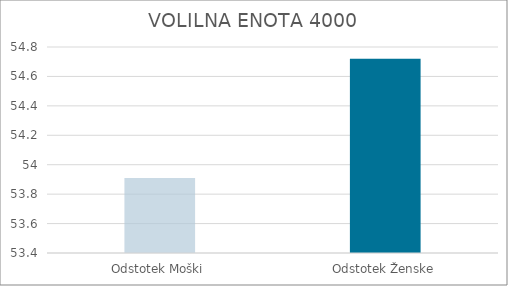
| Category | Series 0 |
|---|---|
| Odstotek Moški | 53.91 |
| Odstotek Ženske | 54.72 |